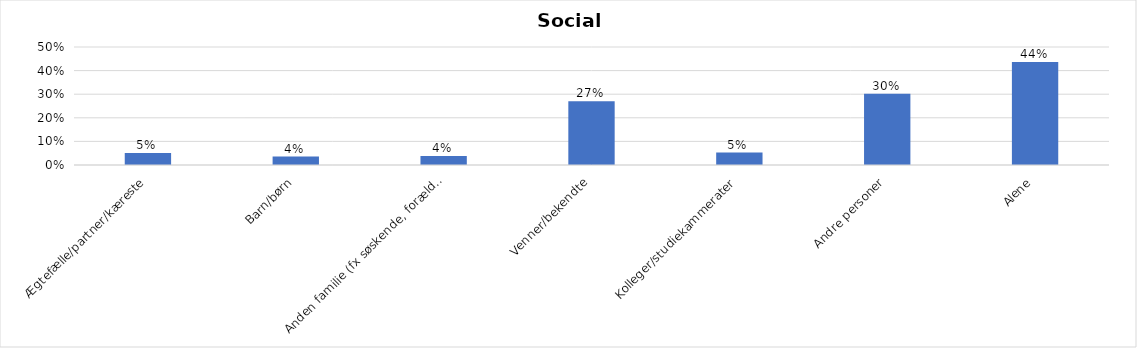
| Category | % |
|---|---|
| Ægtefælle/partner/kæreste | 0.051 |
| Barn/børn | 0.035 |
| Anden familie (fx søskende, forældre) | 0.038 |
| Venner/bekendte | 0.27 |
| Kolleger/studiekammerater | 0.053 |
| Andre personer | 0.302 |
| Alene | 0.437 |